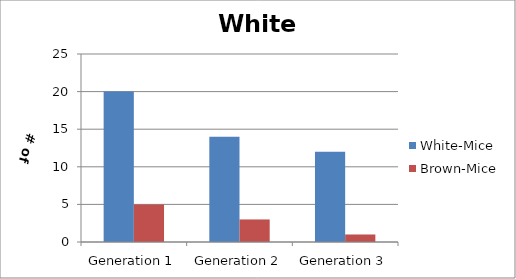
| Category | White-Mice | Brown-Mice |
|---|---|---|
| Generation 1 | 20 | 5 |
| Generation 2 | 14 | 3 |
| Generation 3 | 12 | 1 |